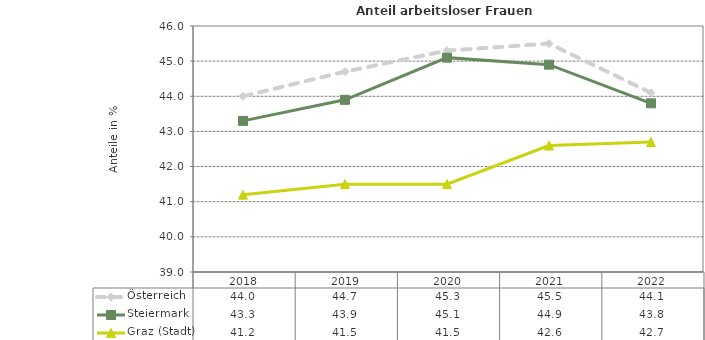
| Category | Österreich | Steiermark | Graz (Stadt) |
|---|---|---|---|
| 2022.0 | 44.1 | 43.8 | 42.7 |
| 2021.0 | 45.5 | 44.9 | 42.6 |
| 2020.0 | 45.3 | 45.1 | 41.5 |
| 2019.0 | 44.7 | 43.9 | 41.5 |
| 2018.0 | 44 | 43.3 | 41.2 |